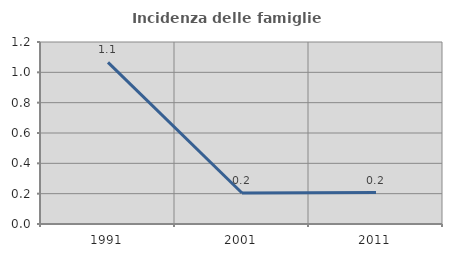
| Category | Incidenza delle famiglie numerose |
|---|---|
| 1991.0 | 1.066 |
| 2001.0 | 0.204 |
| 2011.0 | 0.207 |